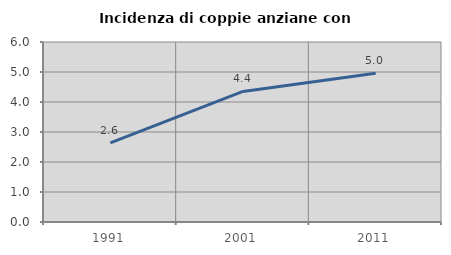
| Category | Incidenza di coppie anziane con figli |
|---|---|
| 1991.0 | 2.639 |
| 2001.0 | 4.354 |
| 2011.0 | 4.956 |